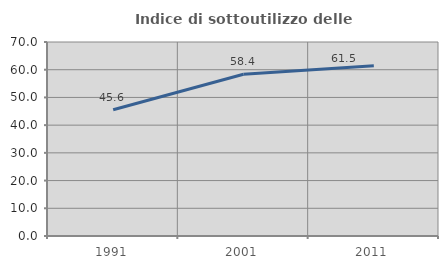
| Category | Indice di sottoutilizzo delle abitazioni  |
|---|---|
| 1991.0 | 45.56 |
| 2001.0 | 58.364 |
| 2011.0 | 61.471 |